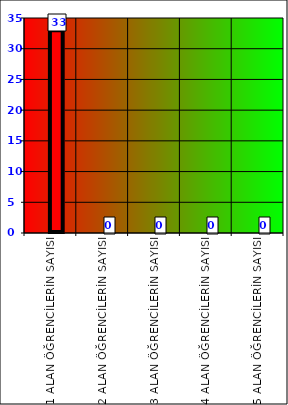
| Category | Series 0 | Series 1 |
|---|---|---|
| 1 ALAN ÖĞRENCİLERİN SAYISI |  | 33 |
| 2 ALAN ÖĞRENCİLERİN SAYISI |  | 0 |
| 3 ALAN ÖĞRENCİLERİN SAYISI |  | 0 |
| 4 ALAN ÖĞRENCİLERİN SAYISI |  | 0 |
| 5 ALAN ÖĞRENCİLERİN SAYISI |  | 0 |